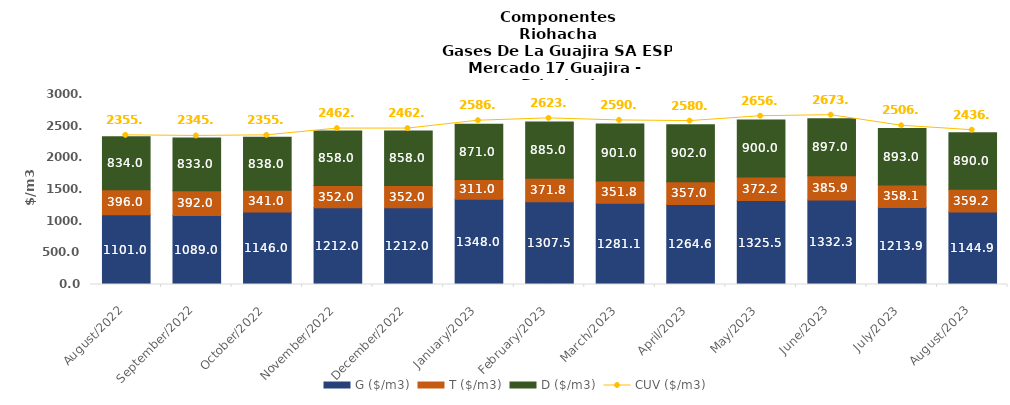
| Category | G ($/m3) | T ($/m3) | D ($/m3) |
|---|---|---|---|
| 2022-08-01 | 1101 | 396 | 834 |
| 2022-09-01 | 1089 | 392 | 833 |
| 2022-10-01 | 1146 | 341 | 838 |
| 2022-11-01 | 1212 | 352 | 858 |
| 2022-12-01 | 1212 | 352 | 858 |
| 2023-01-01 | 1348 | 310.95 | 871 |
| 2023-02-01 | 1307.53 | 371.84 | 885 |
| 2023-03-01 | 1281.1 | 351.77 | 901 |
| 2023-04-01 | 1264.63 | 356.99 | 902 |
| 2023-05-01 | 1325.54 | 372.19 | 900 |
| 2023-06-01 | 1332.29 | 385.86 | 897 |
| 2023-07-01 | 1213.88 | 358.06 | 893 |
| 2023-08-01 | 1144.92 | 359.17 | 890 |